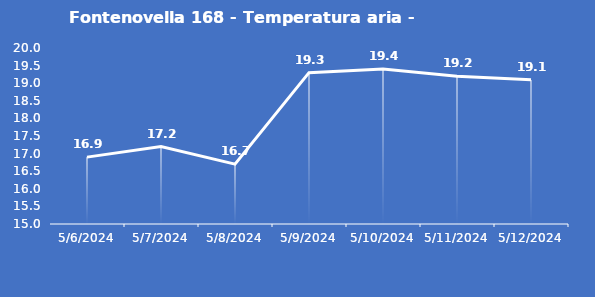
| Category | Fontenovella 168 - Temperatura aria - Grezzo (°C) |
|---|---|
| 5/6/24 | 16.9 |
| 5/7/24 | 17.2 |
| 5/8/24 | 16.7 |
| 5/9/24 | 19.3 |
| 5/10/24 | 19.4 |
| 5/11/24 | 19.2 |
| 5/12/24 | 19.1 |